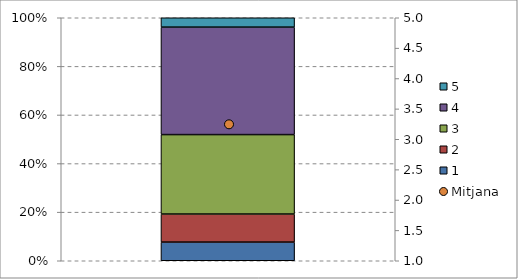
| Category | 1 | 2 | 3 | 4 | 5 |
|---|---|---|---|---|---|
| 0 | 0.077 | 0.115 | 0.327 | 0.442 | 0.038 |